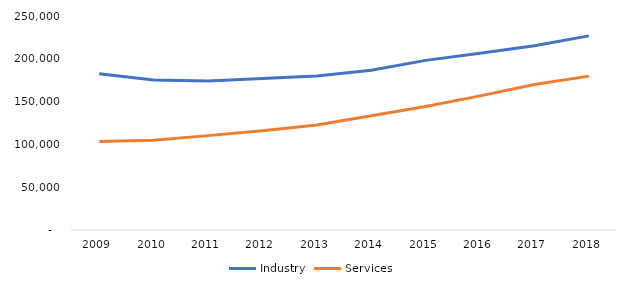
| Category | Industry | Services |
|---|---|---|
| 2009.0 | 182592 | 103520 |
| 2010.0 | 175286 | 104884 |
| 2011.0 | 174056 | 110246 |
| 2012.0 | 176856 | 115856 |
| 2013.0 | 179983 | 122602 |
| 2014.0 | 186616 | 133537 |
| 2015.0 | 198146 | 144199 |
| 2016.0 | 206552 | 156711 |
| 2017.0 | 215331 | 169910 |
| 2018.0 | 226758 | 179762 |